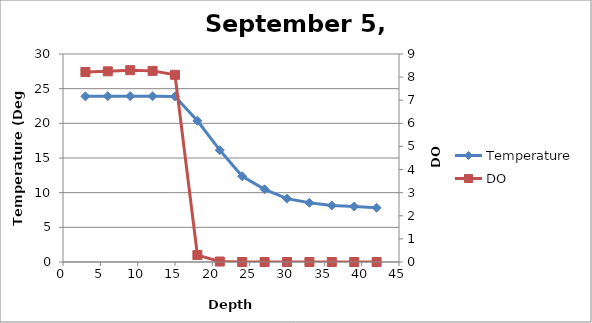
| Category | Temperature |
|---|---|
| 3.0 | 23.89 |
| 6.0 | 23.92 |
| 9.0 | 23.92 |
| 12.0 | 23.91 |
| 15.0 | 23.88 |
| 18.0 | 20.36 |
| 21.0 | 16.13 |
| 24.0 | 12.37 |
| 27.0 | 10.48 |
| 30.0 | 9.14 |
| 33.0 | 8.54 |
| 36.0 | 8.15 |
| 39.0 | 8.01 |
| 42.0 | 7.82 |